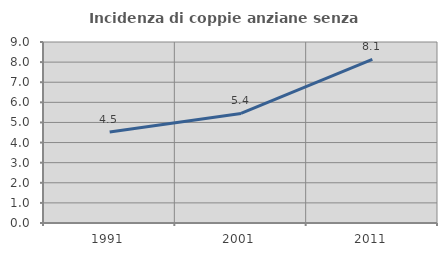
| Category | Incidenza di coppie anziane senza figli  |
|---|---|
| 1991.0 | 4.521 |
| 2001.0 | 5.446 |
| 2011.0 | 8.137 |